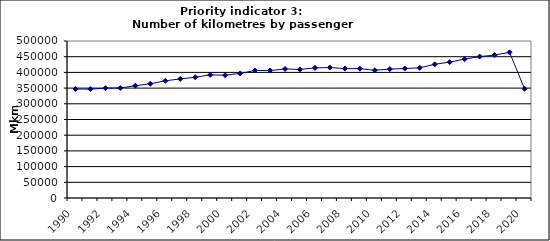
| Category | Number of kilometres by passenger cars, Mkm |
|---|---|
| 1990 | 347121.52 |
| 1991 | 346663.773 |
| 1992 | 349874.831 |
| 1993 | 350271.132 |
| 1994 | 357496.814 |
| 1995 | 363891.087 |
| 1996 | 373090.262 |
| 1997 | 379361.786 |
| 1998 | 384558.439 |
| 1999 | 392061.376 |
| 2000 | 391196.253 |
| 2001 | 396782.462 |
| 2002 | 406184.649 |
| 2003 | 405846.693 |
| 2004 | 410881.608 |
| 2005 | 409491.17 |
| 2006 | 414364.047 |
| 2007 | 415549.977 |
| 2008 | 412136.52 |
| 2009 | 411731.416 |
| 2010 | 406858.929 |
| 2011 | 410594.579 |
| 2012 | 412370.034 |
| 2013 | 414685.204 |
| 2014 | 425719.972 |
| 2015 | 432853.341 |
| 2016 | 442365.528 |
| 2017 | 450366.106 |
| 2018 | 455098.243 |
| 2019 | 464001.958 |
| 2020 | 347889.936 |